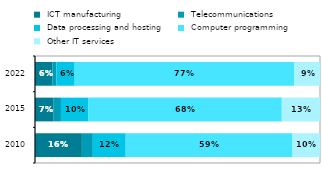
| Category |  ICT manufacturing |  Telecommunications |  Data processing and hosting |  Computer programming |  Other IT services  |
|---|---|---|---|---|---|
| 2010.0 | 0.164 | 0.038 | 0.115 | 0.585 | 0.096 |
| 2015.0 | 0.065 | 0.026 | 0.095 | 0.68 | 0.134 |
| 2022.0 | 0.061 | 0.014 | 0.064 | 0.77 | 0.091 |